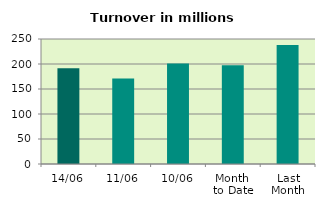
| Category | Series 0 |
|---|---|
| 14/06 | 191.698 |
| 11/06 | 171.204 |
| 10/06 | 200.857 |
| Month 
to Date | 197.338 |
| Last
Month | 237.894 |